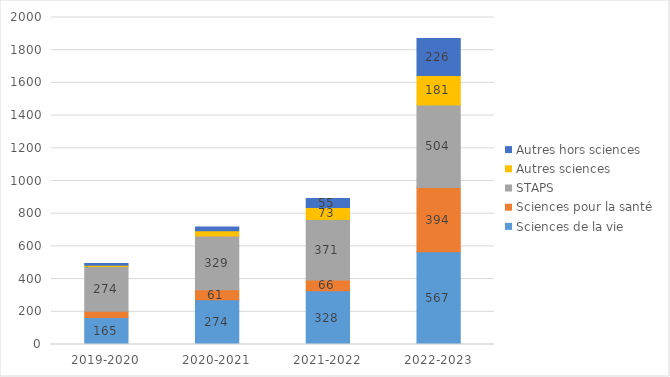
| Category | Sciences de la vie | Sciences pour la santé | STAPS | Autres sciences | Autres hors sciences  |
|---|---|---|---|---|---|
| 2019-2020 | 165 | 38 | 274 | 8 | 11 |
| 2020-2021 | 274 | 61 | 329 | 31 | 23 |
| 2021-2022 | 328 | 66 | 371 | 73 | 55 |
| 2022-2023 | 567 | 394 | 504 | 181 | 226 |